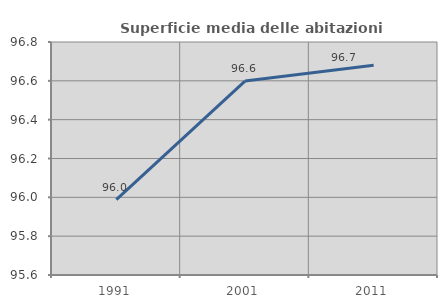
| Category | Superficie media delle abitazioni occupate |
|---|---|
| 1991.0 | 95.989 |
| 2001.0 | 96.599 |
| 2011.0 | 96.68 |